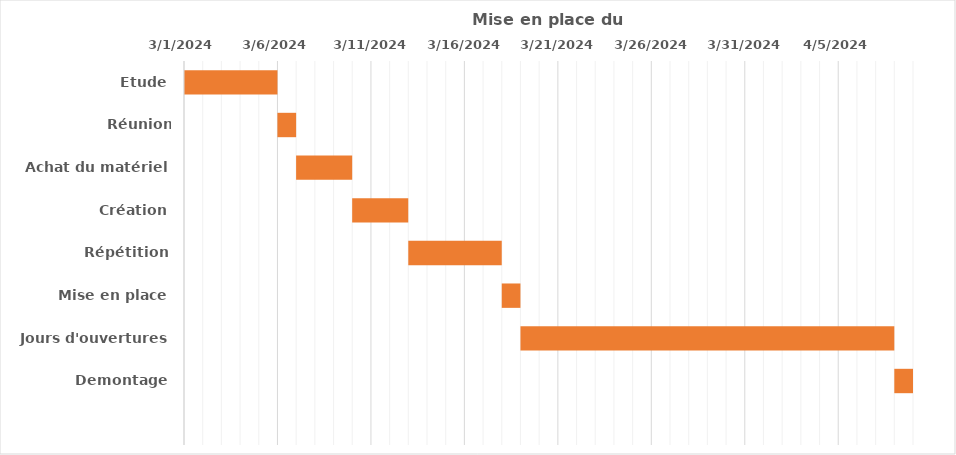
| Category | Series 0 | Duree |
|---|---|---|
| Etude | 3/1/24 | 5 |
| Réunion d'information | 3/6/24 | 1 |
| Achat du matériel | 3/7/24 | 3 |
| Création | 3/10/24 | 3 |
| Répétition | 3/13/24 | 5 |
| Mise en place | 3/18/24 | 1 |
| Jours d'ouvertures | 3/19/24 | 20 |
| Demontage | 4/8/24 | 1 |